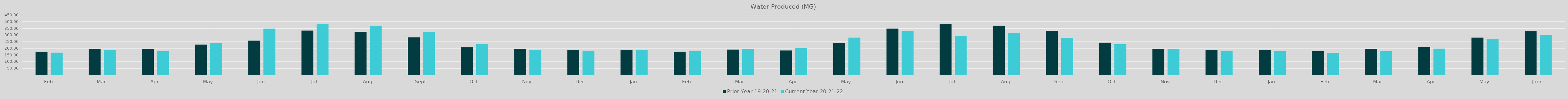
| Category | Prior Year 19-20-21 | Current Year 20-21-22 |
|---|---|---|
| Feb | 173.847 | 167.532 |
| Mar | 195.333 | 190.306 |
| Apr | 193.551 | 178.22 |
| May | 228.091 | 240.625 |
| Jun | 257.9 | 348.57 |
| Jul | 333.37 | 381.34 |
| Aug | 323.49 | 370.12 |
| Sep | 282.53 | 320.39 |
| Oct | 208.72 | 233.34 |
| Nov | 193.92 | 187.14 |
| Dec | 188.86 | 182.02 |
| Jan | 189.94 | 189.96 |
| Feb | 173.75 | 178.97 |
| Mar | 190.77 | 195.96 |
| Apr | 184.23 | 203.05 |
| May | 240.63 | 280.19 |
| Jun | 348.57 | 329.038 |
| Jul | 381.336 | 293.585 |
| Aug | 370.12 | 314.51 |
| Sep | 331.274 | 279.105 |
| Oct | 242.62 | 230.88 |
| Nov | 193.57 | 196.185 |
| Dec | 188.584 | 182.826 |
| Jan | 189.967 | 179.43 |
| Feb | 178.97 | 165.72 |
| Mar | 195.963 | 178.569 |
| Apr | 209.272 | 197.981 |
| May | 280.192 | 268.985 |
| June | 329.04 | 300.92 |